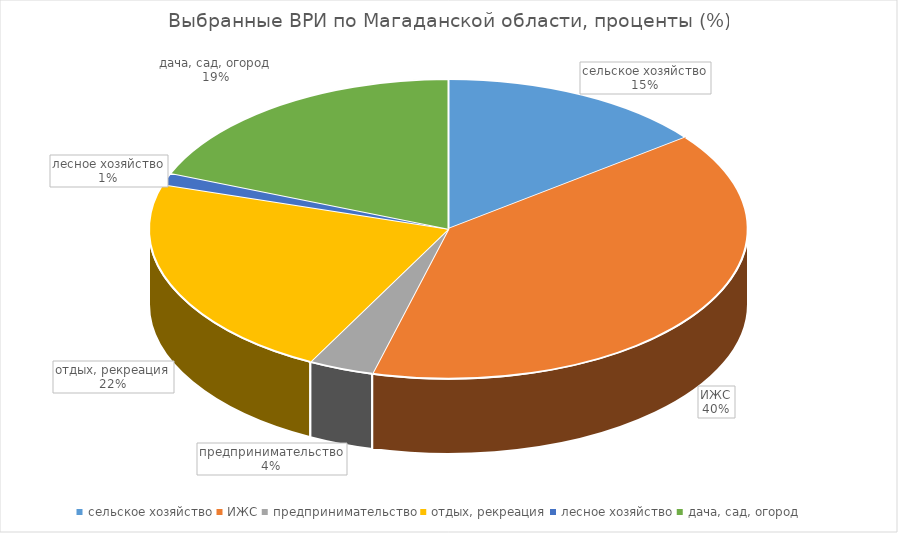
| Category | Магаданская область |
|---|---|
| сельское хозяйство | 14.548 |
| ИЖС | 39.548 |
| предпринимательство | 3.531 |
| отдых, рекреация | 22.175 |
| лесное хозяйство | 1.271 |
| дача, сад, огород | 18.927 |